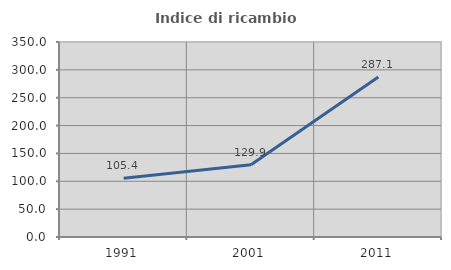
| Category | Indice di ricambio occupazionale  |
|---|---|
| 1991.0 | 105.392 |
| 2001.0 | 129.864 |
| 2011.0 | 287.121 |